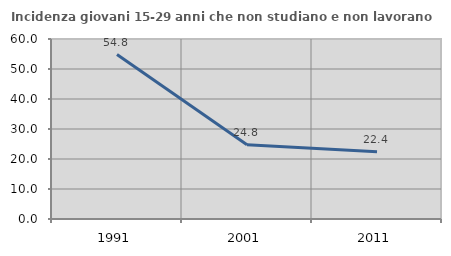
| Category | Incidenza giovani 15-29 anni che non studiano e non lavorano  |
|---|---|
| 1991.0 | 54.81 |
| 2001.0 | 24.757 |
| 2011.0 | 22.404 |